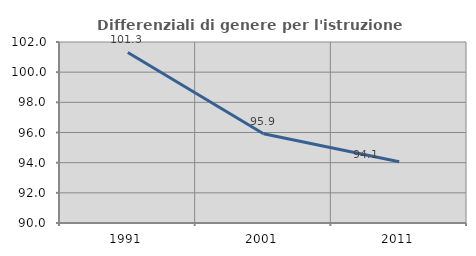
| Category | Differenziali di genere per l'istruzione superiore |
|---|---|
| 1991.0 | 101.307 |
| 2001.0 | 95.911 |
| 2011.0 | 94.064 |